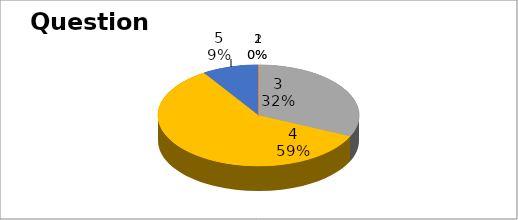
| Category | Series 0 |
|---|---|
| 0 | 0 |
| 1 | 0 |
| 2 | 7 |
| 3 | 13 |
| 4 | 2 |